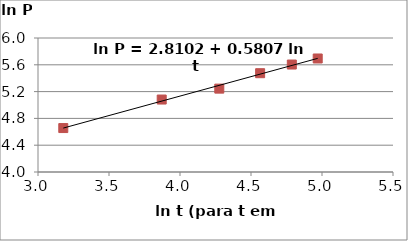
| Category | Series 1 |
|---|---|
| 3.1780538303479458 | 4.656 |
| 3.871201010907891 | 5.081 |
| 4.276666119016055 | 5.244 |
| 4.564348191467836 | 5.475 |
| 4.787491742782046 | 5.604 |
| 4.969813299576001 | 5.694 |